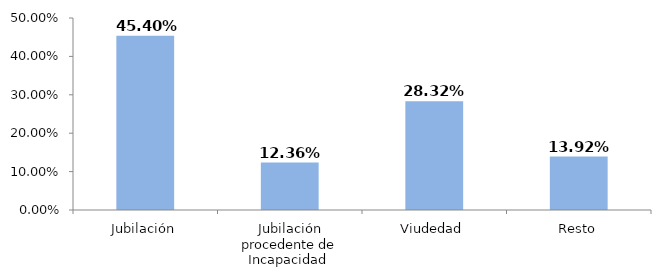
| Category | Series 0 |
|---|---|
| Jubilación | 0.454 |
| Jubilación procedente de Incapacidad  | 0.124 |
| Viudedad | 0.283 |
| Resto | 0.139 |